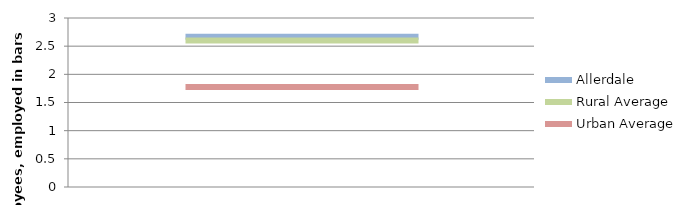
| Category | Allerdale | Rural Average | Urban Average |
|---|---|---|---|
| 0 | 2.667 | 2.599 | 1.776 |
| 1 | 2.667 | 2.599 | 1.776 |